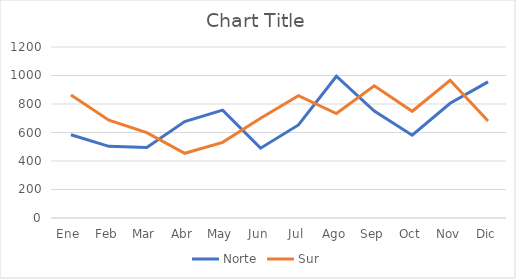
| Category | Norte | Sur |
|---|---|---|
| Ene | 584 | 863 |
| Feb | 503 | 686 |
| Mar | 495 | 599 |
| Abr | 677 | 454 |
| May | 757 | 531 |
| Jun | 490 | 700 |
| Jul | 653 | 858 |
| Ago | 995 | 733 |
| Sep | 750 | 928 |
| Oct | 581 | 749 |
| Nov | 805 | 966 |
| Dic | 955 | 681 |